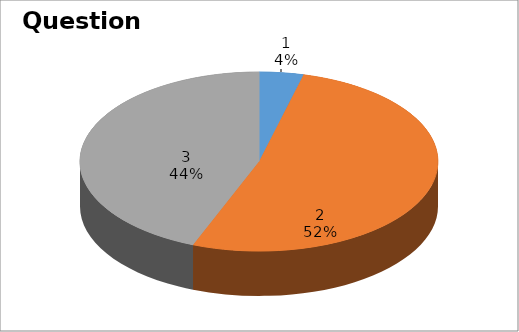
| Category | Series 0 |
|---|---|
| 0 | 1 |
| 1 | 13 |
| 2 | 11 |